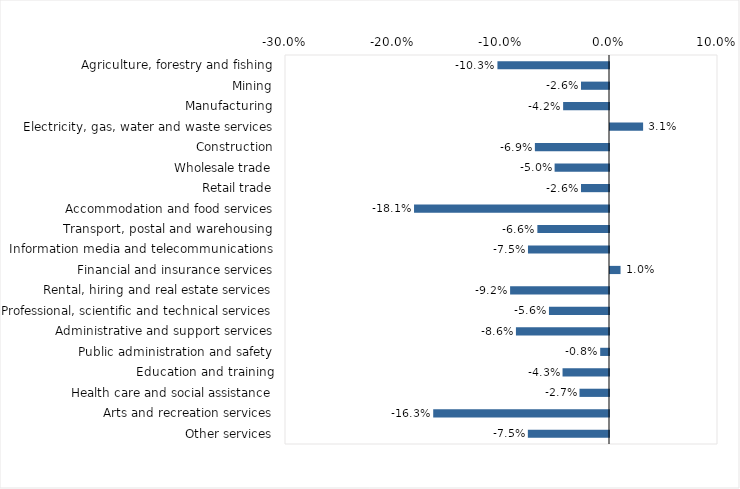
| Category | This week |
|---|---|
| Agriculture, forestry and fishing | -0.103 |
| Mining | -0.026 |
| Manufacturing | -0.042 |
| Electricity, gas, water and waste services | 0.031 |
| Construction | -0.069 |
| Wholesale trade | -0.05 |
| Retail trade | -0.026 |
| Accommodation and food services | -0.181 |
| Transport, postal and warehousing | -0.066 |
| Information media and telecommunications | -0.075 |
| Financial and insurance services | 0.01 |
| Rental, hiring and real estate services | -0.092 |
| Professional, scientific and technical services | -0.056 |
| Administrative and support services | -0.086 |
| Public administration and safety | -0.008 |
| Education and training | -0.043 |
| Health care and social assistance | -0.027 |
| Arts and recreation services | -0.163 |
| Other services | -0.075 |